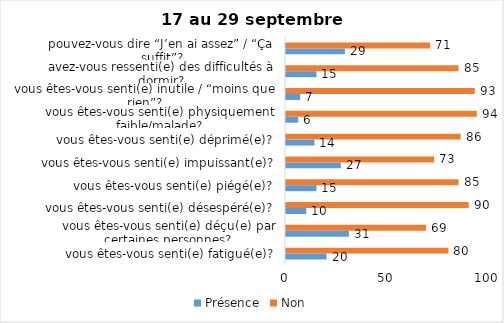
| Category | Présence | Non |
|---|---|---|
| vous êtes-vous senti(e) fatigué(e)? | 20 | 80 |
| vous êtes-vous senti(e) déçu(e) par certaines personnes? | 31 | 69 |
| vous êtes-vous senti(e) désespéré(e)? | 10 | 90 |
| vous êtes-vous senti(e) piégé(e)? | 15 | 85 |
| vous êtes-vous senti(e) impuissant(e)? | 27 | 73 |
| vous êtes-vous senti(e) déprimé(e)? | 14 | 86 |
| vous êtes-vous senti(e) physiquement faible/malade? | 6 | 94 |
| vous êtes-vous senti(e) inutile / “moins que rien”? | 7 | 93 |
| avez-vous ressenti(e) des difficultés à dormir? | 15 | 85 |
| pouvez-vous dire “J’en ai assez” / “Ça suffit”? | 29 | 71 |